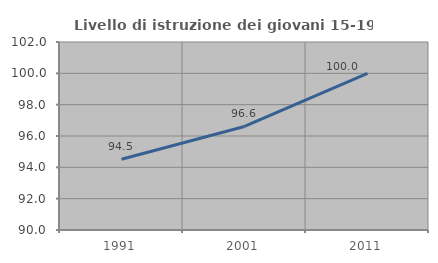
| Category | Livello di istruzione dei giovani 15-19 anni |
|---|---|
| 1991.0 | 94.521 |
| 2001.0 | 96.61 |
| 2011.0 | 100 |